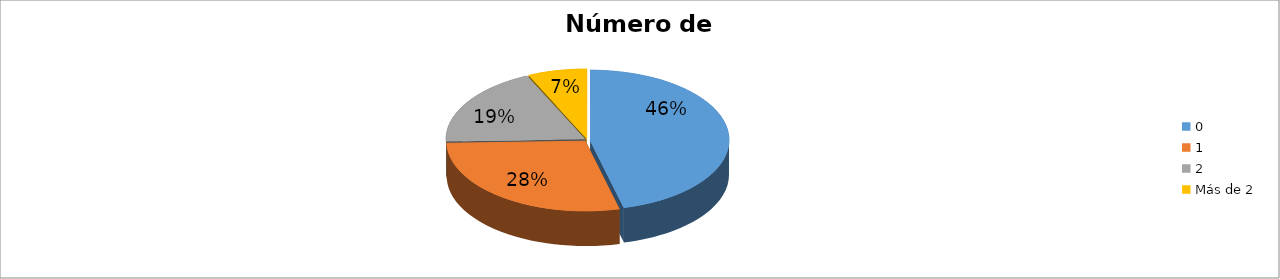
| Category | Series 0 |
|---|---|
| 0 | 0.461 |
| 1 | 0.284 |
| 2 | 0.186 |
| Más de 2 | 0.069 |